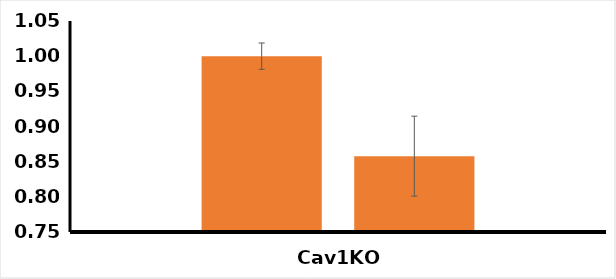
| Category | Cav1KO | Cav1KO+shRNATln2+siRNATln1 |
|---|---|---|
| 0 | 1 | 0.858 |